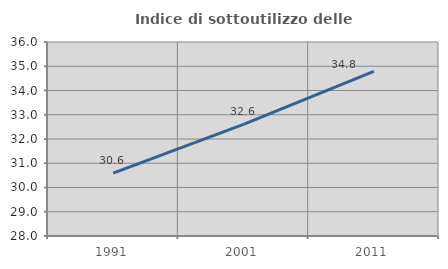
| Category | Indice di sottoutilizzo delle abitazioni  |
|---|---|
| 1991.0 | 30.592 |
| 2001.0 | 32.605 |
| 2011.0 | 34.789 |